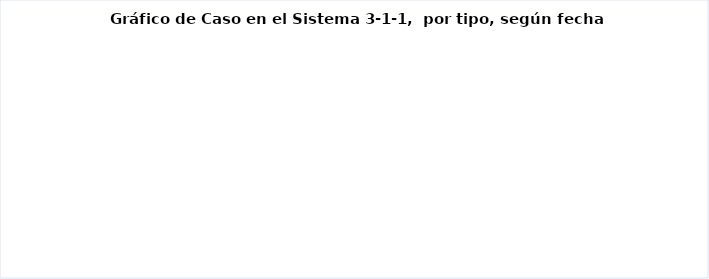
| Category | Series 0 |
|---|---|
| Quejas  | 0 |
| Reclamaciones  | 0 |
| Sugerencias  | 0 |